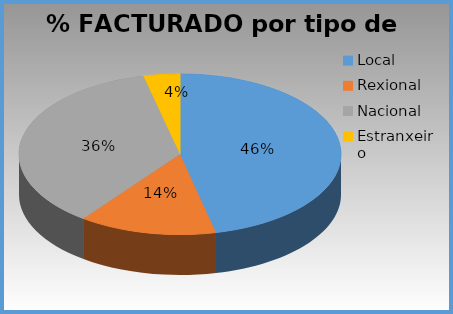
| Category | % facturado |
|---|---|
| Local | 0.464 |
| Rexional | 0.138 |
| Nacional | 0.361 |
| Estranxeiro | 0.037 |